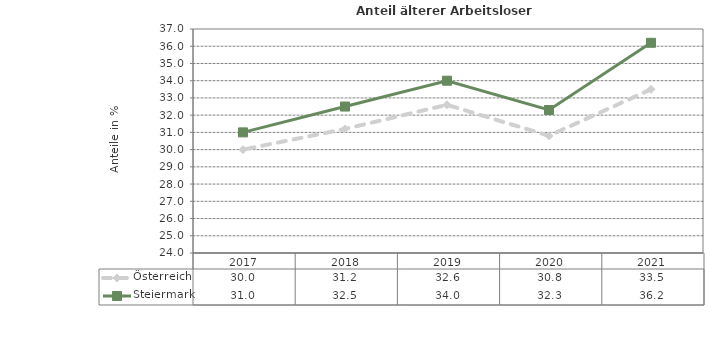
| Category | Österreich | Steiermark |
|---|---|---|
| 2021.0 | 33.5 | 36.2 |
| 2020.0 | 30.8 | 32.3 |
| 2019.0 | 32.6 | 34 |
| 2018.0 | 31.2 | 32.5 |
| 2017.0 | 30 | 31 |